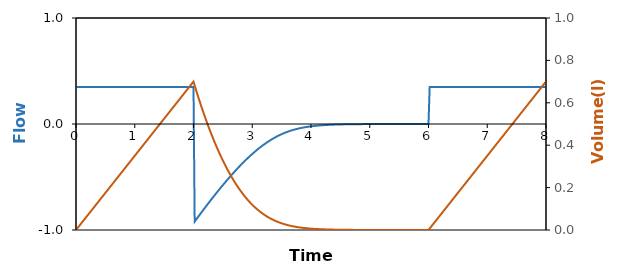
| Category | V' |
|---|---|
| 0.0 | 0.35 |
| 0.02 | 0.35 |
| 0.04 | 0.35 |
| 0.06 | 0.35 |
| 0.08 | 0.35 |
| 0.1 | 0.35 |
| 0.12 | 0.35 |
| 0.14 | 0.35 |
| 0.16 | 0.35 |
| 0.18 | 0.35 |
| 0.2 | 0.35 |
| 0.22 | 0.35 |
| 0.24 | 0.35 |
| 0.26 | 0.35 |
| 0.28 | 0.35 |
| 0.3 | 0.35 |
| 0.32 | 0.35 |
| 0.34 | 0.35 |
| 0.36 | 0.35 |
| 0.38 | 0.35 |
| 0.4 | 0.35 |
| 0.42 | 0.35 |
| 0.44 | 0.35 |
| 0.46 | 0.35 |
| 0.48 | 0.35 |
| 0.5 | 0.35 |
| 0.52 | 0.35 |
| 0.54 | 0.35 |
| 0.56 | 0.35 |
| 0.58 | 0.35 |
| 0.6 | 0.35 |
| 0.62 | 0.35 |
| 0.64 | 0.35 |
| 0.66 | 0.35 |
| 0.68 | 0.35 |
| 0.7 | 0.35 |
| 0.72 | 0.35 |
| 0.74 | 0.35 |
| 0.76 | 0.35 |
| 0.78 | 0.35 |
| 0.8 | 0.35 |
| 0.82 | 0.35 |
| 0.84 | 0.35 |
| 0.86 | 0.35 |
| 0.88 | 0.35 |
| 0.9 | 0.35 |
| 0.92 | 0.35 |
| 0.94 | 0.35 |
| 0.96 | 0.35 |
| 0.98 | 0.35 |
| 1.0 | 0.35 |
| 1.02 | 0.35 |
| 1.04 | 0.35 |
| 1.06 | 0.35 |
| 1.08 | 0.35 |
| 1.1 | 0.35 |
| 1.12 | 0.35 |
| 1.14 | 0.35 |
| 1.16 | 0.35 |
| 1.18 | 0.35 |
| 1.2 | 0.35 |
| 1.22 | 0.35 |
| 1.24 | 0.35 |
| 1.26 | 0.35 |
| 1.28 | 0.35 |
| 1.3 | 0.35 |
| 1.32 | 0.35 |
| 1.34 | 0.35 |
| 1.36 | 0.35 |
| 1.38 | 0.35 |
| 1.4 | 0.35 |
| 1.42 | 0.35 |
| 1.44 | 0.35 |
| 1.46 | 0.35 |
| 1.48 | 0.35 |
| 1.5 | 0.35 |
| 1.52 | 0.35 |
| 1.54 | 0.35 |
| 1.56 | 0.35 |
| 1.58 | 0.35 |
| 1.6 | 0.35 |
| 1.62 | 0.35 |
| 1.64 | 0.35 |
| 1.66 | 0.35 |
| 1.68 | 0.35 |
| 1.7 | 0.35 |
| 1.72 | 0.35 |
| 1.74 | 0.35 |
| 1.76 | 0.35 |
| 1.78 | 0.35 |
| 1.8 | 0.35 |
| 1.82 | 0.35 |
| 1.84 | 0.35 |
| 1.86 | 0.35 |
| 1.88 | 0.35 |
| 1.9 | 0.35 |
| 1.92 | 0.35 |
| 1.94 | 0.35 |
| 1.96 | 0.35 |
| 1.98 | 0.35 |
| 2.0 | 0.35 |
| 2.02 | -0.921 |
| 2.04 | -0.905 |
| 2.06 | -0.89 |
| 2.08 | -0.875 |
| 2.1 | -0.86 |
| 2.12 | -0.845 |
| 2.14 | -0.831 |
| 2.16 | -0.816 |
| 2.18 | -0.801 |
| 2.2 | -0.786 |
| 2.22 | -0.772 |
| 2.24 | -0.757 |
| 2.26 | -0.743 |
| 2.28 | -0.729 |
| 2.3 | -0.714 |
| 2.32 | -0.7 |
| 2.34 | -0.686 |
| 2.36 | -0.672 |
| 2.38 | -0.658 |
| 2.4 | -0.644 |
| 2.42 | -0.63 |
| 2.44 | -0.617 |
| 2.46 | -0.603 |
| 2.48 | -0.59 |
| 2.5 | -0.576 |
| 2.52 | -0.563 |
| 2.54 | -0.55 |
| 2.56 | -0.537 |
| 2.58 | -0.524 |
| 2.6 | -0.511 |
| 2.62 | -0.499 |
| 2.64 | -0.486 |
| 2.66 | -0.473 |
| 2.68 | -0.461 |
| 2.7 | -0.449 |
| 2.72 | -0.437 |
| 2.74 | -0.425 |
| 2.76 | -0.413 |
| 2.78 | -0.401 |
| 2.8 | -0.39 |
| 2.82 | -0.378 |
| 2.84 | -0.367 |
| 2.86 | -0.356 |
| 2.88 | -0.345 |
| 2.9 | -0.334 |
| 2.92 | -0.324 |
| 2.94 | -0.313 |
| 2.96 | -0.303 |
| 2.98 | -0.293 |
| 3.0 | -0.283 |
| 3.02 | -0.273 |
| 3.04 | -0.263 |
| 3.06 | -0.254 |
| 3.08 | -0.245 |
| 3.1 | -0.236 |
| 3.12 | -0.227 |
| 3.14 | -0.218 |
| 3.16 | -0.21 |
| 3.18 | -0.201 |
| 3.2 | -0.193 |
| 3.22 | -0.185 |
| 3.24 | -0.178 |
| 3.26 | -0.17 |
| 3.28 | -0.163 |
| 3.3 | -0.156 |
| 3.32 | -0.149 |
| 3.34 | -0.142 |
| 3.36 | -0.136 |
| 3.38 | -0.129 |
| 3.4 | -0.123 |
| 3.42 | -0.118 |
| 3.44 | -0.112 |
| 3.46 | -0.106 |
| 3.48 | -0.101 |
| 3.5 | -0.096 |
| 3.52 | -0.091 |
| 3.54 | -0.086 |
| 3.56 | -0.082 |
| 3.58 | -0.078 |
| 3.6 | -0.074 |
| 3.62 | -0.07 |
| 3.64 | -0.066 |
| 3.66 | -0.062 |
| 3.68 | -0.059 |
| 3.7 | -0.055 |
| 3.72 | -0.052 |
| 3.74 | -0.049 |
| 3.76 | -0.046 |
| 3.78 | -0.044 |
| 3.8 | -0.041 |
| 3.82 | -0.039 |
| 3.84 | -0.037 |
| 3.86 | -0.034 |
| 3.88 | -0.032 |
| 3.9 | -0.03 |
| 3.92 | -0.028 |
| 3.94 | -0.027 |
| 3.96 | -0.025 |
| 3.98 | -0.024 |
| 4.0 | -0.022 |
| 4.02 | -0.021 |
| 4.04 | -0.019 |
| 4.06 | -0.018 |
| 4.08 | -0.017 |
| 4.1 | -0.016 |
| 4.12 | -0.015 |
| 4.14 | -0.014 |
| 4.16 | -0.013 |
| 4.18 | -0.012 |
| 4.2 | -0.011 |
| 4.22 | -0.011 |
| 4.24 | -0.01 |
| 4.26 | -0.009 |
| 4.28 | -0.009 |
| 4.3 | -0.008 |
| 4.32 | -0.008 |
| 4.34 | -0.007 |
| 4.36 | -0.007 |
| 4.38 | -0.006 |
| 4.4 | -0.006 |
| 4.42 | -0.005 |
| 4.44 | -0.005 |
| 4.46 | -0.005 |
| 4.48 | -0.004 |
| 4.5 | -0.004 |
| 4.52 | -0.004 |
| 4.54 | -0.004 |
| 4.56 | -0.003 |
| 4.58 | -0.003 |
| 4.6 | -0.003 |
| 4.62 | -0.003 |
| 4.64 | -0.003 |
| 4.66 | -0.002 |
| 4.68 | -0.002 |
| 4.7 | -0.002 |
| 4.72 | -0.002 |
| 4.74 | -0.002 |
| 4.76 | -0.002 |
| 4.78 | -0.002 |
| 4.8 | -0.002 |
| 4.82 | -0.001 |
| 4.84 | -0.001 |
| 4.86 | -0.001 |
| 4.88 | -0.001 |
| 4.9 | -0.001 |
| 4.92 | -0.001 |
| 4.94 | -0.001 |
| 4.96 | -0.001 |
| 4.98 | -0.001 |
| 5.0 | -0.001 |
| 5.02 | -0.001 |
| 5.04 | -0.001 |
| 5.06 | -0.001 |
| 5.08 | -0.001 |
| 5.1 | -0.001 |
| 5.12 | 0 |
| 5.14 | 0 |
| 5.16 | 0 |
| 5.18 | 0 |
| 5.2 | 0 |
| 5.22 | 0 |
| 5.23999999999999 | 0 |
| 5.25999999999999 | 0 |
| 5.27999999999999 | 0 |
| 5.29999999999999 | 0 |
| 5.31999999999999 | 0 |
| 5.33999999999999 | 0 |
| 5.35999999999999 | 0 |
| 5.37999999999999 | 0 |
| 5.39999999999999 | 0 |
| 5.41999999999999 | 0 |
| 5.43999999999999 | 0 |
| 5.45999999999999 | 0 |
| 5.47999999999999 | 0 |
| 5.49999999999999 | 0 |
| 5.51999999999999 | 0 |
| 5.53999999999999 | 0 |
| 5.55999999999999 | 0 |
| 5.57999999999999 | 0 |
| 5.59999999999999 | 0 |
| 5.61999999999999 | 0 |
| 5.63999999999999 | 0 |
| 5.65999999999999 | 0 |
| 5.67999999999999 | 0 |
| 5.69999999999999 | 0 |
| 5.71999999999998 | 0 |
| 5.73999999999998 | 0 |
| 5.75999999999998 | 0 |
| 5.77999999999998 | 0 |
| 5.79999999999998 | 0 |
| 5.81999999999998 | 0 |
| 5.83999999999998 | 0 |
| 5.85999999999998 | 0 |
| 5.87999999999998 | 0 |
| 5.89999999999998 | 0 |
| 5.91999999999998 | 0 |
| 5.93999999999998 | 0 |
| 5.95999999999998 | 0 |
| 5.97999999999998 | 0 |
| 5.99999999999998 | 0 |
| 6.01999999999998 | 0.35 |
| 6.03999999999998 | 0.35 |
| 6.05999999999998 | 0.35 |
| 6.07999999999998 | 0.35 |
| 6.09999999999998 | 0.35 |
| 6.11999999999998 | 0.35 |
| 6.13999999999998 | 0.35 |
| 6.15999999999997 | 0.35 |
| 6.17999999999997 | 0.35 |
| 6.19999999999997 | 0.35 |
| 6.21999999999997 | 0.35 |
| 6.23999999999997 | 0.35 |
| 6.25999999999997 | 0.35 |
| 6.27999999999997 | 0.35 |
| 6.29999999999997 | 0.35 |
| 6.31999999999997 | 0.35 |
| 6.33999999999997 | 0.35 |
| 6.35999999999997 | 0.35 |
| 6.37999999999997 | 0.35 |
| 6.39999999999997 | 0.35 |
| 6.41999999999997 | 0.35 |
| 6.43999999999997 | 0.35 |
| 6.45999999999997 | 0.35 |
| 6.47999999999997 | 0.35 |
| 6.49999999999997 | 0.35 |
| 6.51999999999996 | 0.35 |
| 6.53999999999996 | 0.35 |
| 6.55999999999996 | 0.35 |
| 6.57999999999996 | 0.35 |
| 6.59999999999996 | 0.35 |
| 6.61999999999996 | 0.35 |
| 6.63999999999996 | 0.35 |
| 6.65999999999996 | 0.35 |
| 6.67999999999996 | 0.35 |
| 6.69999999999996 | 0.35 |
| 6.71999999999996 | 0.35 |
| 6.73999999999996 | 0.35 |
| 6.75999999999996 | 0.35 |
| 6.77999999999996 | 0.35 |
| 6.79999999999996 | 0.35 |
| 6.81999999999996 | 0.35 |
| 6.83999999999996 | 0.35 |
| 6.85999999999996 | 0.35 |
| 6.87999999999996 | 0.35 |
| 6.89999999999996 | 0.35 |
| 6.91999999999996 | 0.35 |
| 6.93999999999996 | 0.35 |
| 6.95999999999996 | 0.35 |
| 6.97999999999996 | 0.35 |
| 6.99999999999995 | 0.35 |
| 7.01999999999994 | 0.35 |
| 7.03999999999993 | 0.35 |
| 7.05999999999992 | 0.35 |
| 7.07999999999991 | 0.35 |
| 7.0999999999999 | 0.35 |
| 7.11999999999989 | 0.35 |
| 7.13999999999989 | 0.35 |
| 7.15999999999988 | 0.35 |
| 7.17999999999987 | 0.35 |
| 7.19999999999986 | 0.35 |
| 7.21999999999985 | 0.35 |
| 7.23999999999984 | 0.35 |
| 7.25999999999983 | 0.35 |
| 7.27999999999982 | 0.35 |
| 7.29999999999981 | 0.35 |
| 7.3199999999997996 | 0.35 |
| 7.33999999999979 | 0.35 |
| 7.35999999999978 | 0.35 |
| 7.37999999999977 | 0.35 |
| 7.39999999999976 | 0.35 |
| 7.41999999999975 | 0.35 |
| 7.43999999999975 | 0.35 |
| 7.45999999999974 | 0.35 |
| 7.47999999999973 | 0.35 |
| 7.49999999999972 | 0.35 |
| 7.51999999999971 | 0.35 |
| 7.5399999999997 | 0.35 |
| 7.55999999999969 | 0.35 |
| 7.57999999999968 | 0.35 |
| 7.59999999999967 | 0.35 |
| 7.61999999999966 | 0.35 |
| 7.63999999999965 | 0.35 |
| 7.65999999999964 | 0.35 |
| 7.67999999999963 | 0.35 |
| 7.69999999999962 | 0.35 |
| 7.71999999999962 | 0.35 |
| 7.73999999999961 | 0.35 |
| 7.7599999999996 | 0.35 |
| 7.77999999999959 | 0.35 |
| 7.79999999999958 | 0.35 |
| 7.81999999999957 | 0.35 |
| 7.83999999999956 | 0.35 |
| 7.85999999999955 | 0.35 |
| 7.87999999999954 | 0.35 |
| 7.89999999999953 | 0.35 |
| 7.91999999999952 | 0.35 |
| 7.93999999999951 | 0.35 |
| 7.9599999999995 | 0.35 |
| 7.97999999999949 | 0.35 |
| 7.99999999999949 | 0.35 |